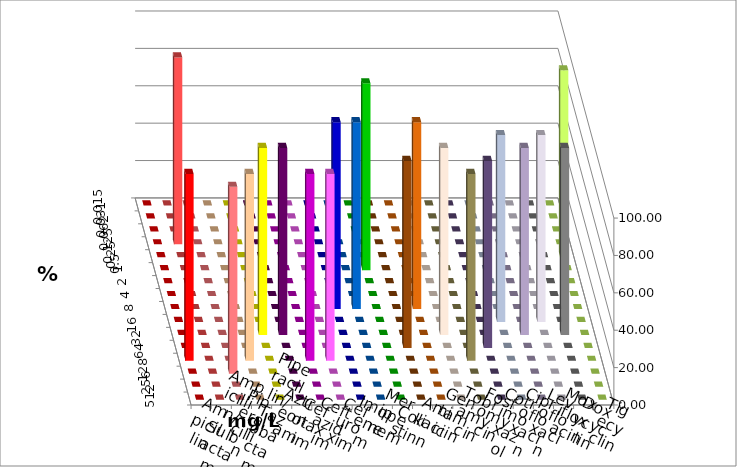
| Category | Ampicillin | Ampicillin/ Sulbactam | Piperacillin | Piperacillin/ Tazobactam | Aztreonam | Cefotaxim | Ceftazidim | Cefuroxim | Imipenem | Meropenem | Colistin | Amikacin | Gentamicin | Tobramycin | Fosfomycin | Cotrimoxazol | Ciprofloxacin | Levofloxacin | Moxifloxacin | Doxycyclin | Tigecyclin |
|---|---|---|---|---|---|---|---|---|---|---|---|---|---|---|---|---|---|---|---|---|---|
| 0.015 | 0 | 0 | 0 | 0 | 0 | 0 | 0 | 0 | 0 | 0 | 0 | 0 | 0 | 0 | 0 | 0 | 0 | 0 | 0 | 0 | 0 |
| 0.031 | 0 | 0 | 0 | 0 | 0 | 0 | 0 | 0 | 0 | 0 | 0 | 0 | 0 | 0 | 0 | 0 | 0 | 0 | 0 | 0 | 0 |
| 0.062 | 0 | 0 | 0 | 0 | 0 | 0 | 0 | 0 | 0 | 0 | 0 | 0 | 0 | 0 | 0 | 0 | 0 | 0 | 0 | 0 | 0 |
| 0.125 | 0 | 100 | 0 | 0 | 0 | 0 | 0 | 0 | 0 | 0 | 0 | 0 | 0 | 0 | 0 | 0 | 0 | 0 | 0 | 0 | 0 |
| 0.25 | 0 | 0 | 0 | 0 | 0 | 0 | 0 | 0 | 0 | 0 | 0 | 0 | 0 | 0 | 0 | 0 | 0 | 0 | 0 | 0 | 100 |
| 0.5 | 0 | 0 | 0 | 0 | 0 | 0 | 0 | 0 | 0 | 0 | 100 | 0 | 0 | 0 | 0 | 0 | 0 | 0 | 0 | 0 | 0 |
| 1.0 | 0 | 0 | 0 | 0 | 0 | 0 | 0 | 0 | 0 | 0 | 0 | 0 | 0 | 0 | 0 | 0 | 0 | 0 | 0 | 0 | 0 |
| 2.0 | 0 | 0 | 0 | 0 | 0 | 0 | 0 | 0 | 0 | 0 | 0 | 0 | 0 | 0 | 0 | 0 | 0 | 0 | 0 | 0 | 0 |
| 4.0 | 0 | 0 | 0 | 0 | 0 | 0 | 0 | 0 | 100 | 100 | 0 | 0 | 100 | 0 | 0 | 0 | 0 | 0 | 0 | 0 | 0 |
| 8.0 | 0 | 0 | 0 | 0 | 0 | 0 | 0 | 0 | 0 | 0 | 0 | 0 | 0 | 0 | 0 | 0 | 100 | 0 | 100 | 0 | 0 |
| 16.0 | 0 | 0 | 0 | 0 | 100 | 100 | 0 | 0 | 0 | 0 | 0 | 0 | 0 | 100 | 0 | 0 | 0 | 100 | 0 | 100 | 0 |
| 32.0 | 0 | 0 | 0 | 0 | 0 | 0 | 0 | 0 | 0 | 0 | 0 | 100 | 0 | 0 | 0 | 100 | 0 | 0 | 0 | 0 | 0 |
| 64.0 | 100 | 0 | 0 | 100 | 0 | 0 | 100 | 100 | 0 | 0 | 0 | 0 | 0 | 0 | 100 | 0 | 0 | 0 | 0 | 0 | 0 |
| 128.0 | 0 | 0 | 100 | 0 | 0 | 0 | 0 | 0 | 0 | 0 | 0 | 0 | 0 | 0 | 0 | 0 | 0 | 0 | 0 | 0 | 0 |
| 256.0 | 0 | 0 | 0 | 0 | 0 | 0 | 0 | 0 | 0 | 0 | 0 | 0 | 0 | 0 | 0 | 0 | 0 | 0 | 0 | 0 | 0 |
| 512.0 | 0 | 0 | 0 | 0 | 0 | 0 | 0 | 0 | 0 | 0 | 0 | 0 | 0 | 0 | 0 | 0 | 0 | 0 | 0 | 0 | 0 |